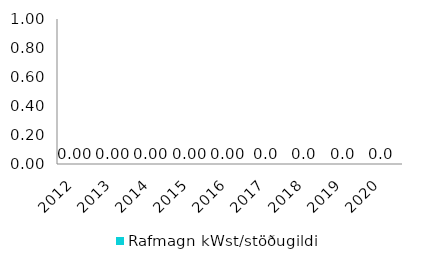
| Category | Rafmagn kWst/stöðugildi |
|---|---|
| 2012.0 | 0 |
| 2013.0 | 0 |
| 2014.0 | 0 |
| 2015.0 | 0 |
| 2016.0 | 0 |
| 2017.0 | 0 |
| 2018.0 | 0 |
| 2019.0 | 0 |
| 2020.0 | 0 |